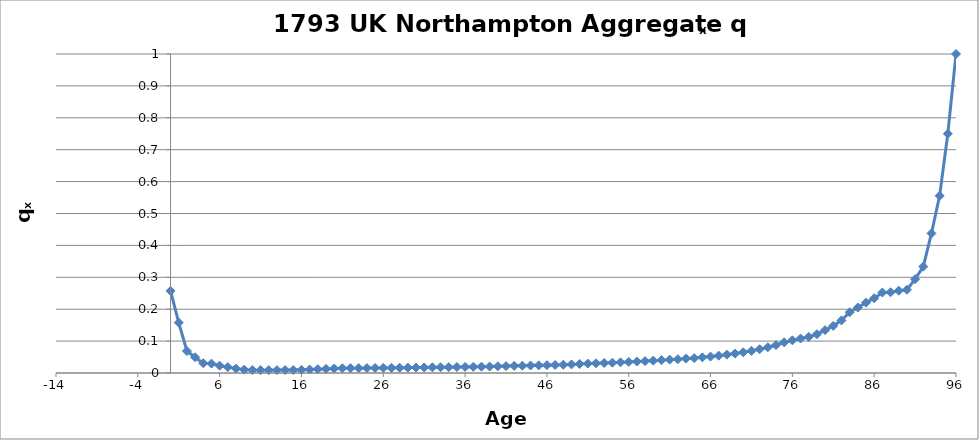
| Category | qx |
|---|---|
| 0.0 | 0.258 |
| 1.0 | 0.158 |
| 2.0 | 0.069 |
| 3.0 | 0.049 |
| 4.0 | 0.031 |
| 5.0 | 0.029 |
| 6.0 | 0.023 |
| 7.0 | 0.019 |
| 8.0 | 0.014 |
| 9.0 | 0.01 |
| 10.0 | 0.009 |
| 11.0 | 0.009 |
| 12.0 | 0.009 |
| 13.0 | 0.009 |
| 14.0 | 0.009 |
| 15.0 | 0.009 |
| 16.0 | 0.01 |
| 17.0 | 0.011 |
| 18.0 | 0.012 |
| 19.0 | 0.013 |
| 20.0 | 0.014 |
| 21.0 | 0.015 |
| 22.0 | 0.015 |
| 23.0 | 0.015 |
| 24.0 | 0.016 |
| 25.0 | 0.016 |
| 26.0 | 0.016 |
| 27.0 | 0.016 |
| 28.0 | 0.017 |
| 29.0 | 0.017 |
| 30.0 | 0.017 |
| 31.0 | 0.017 |
| 32.0 | 0.018 |
| 33.0 | 0.018 |
| 34.0 | 0.018 |
| 35.0 | 0.019 |
| 36.0 | 0.019 |
| 37.0 | 0.019 |
| 38.0 | 0.02 |
| 39.0 | 0.02 |
| 40.0 | 0.021 |
| 41.0 | 0.022 |
| 42.0 | 0.022 |
| 43.0 | 0.023 |
| 44.0 | 0.023 |
| 45.0 | 0.024 |
| 46.0 | 0.025 |
| 47.0 | 0.025 |
| 48.0 | 0.026 |
| 49.0 | 0.027 |
| 50.0 | 0.028 |
| 51.0 | 0.03 |
| 52.0 | 0.03 |
| 53.0 | 0.031 |
| 54.0 | 0.032 |
| 55.0 | 0.034 |
| 56.0 | 0.035 |
| 57.0 | 0.036 |
| 58.0 | 0.037 |
| 59.0 | 0.039 |
| 60.0 | 0.04 |
| 61.0 | 0.042 |
| 62.0 | 0.043 |
| 63.0 | 0.045 |
| 64.0 | 0.047 |
| 65.0 | 0.049 |
| 66.0 | 0.052 |
| 67.0 | 0.054 |
| 68.0 | 0.057 |
| 69.0 | 0.061 |
| 70.0 | 0.065 |
| 71.0 | 0.069 |
| 72.0 | 0.075 |
| 73.0 | 0.081 |
| 74.0 | 0.088 |
| 75.0 | 0.096 |
| 76.0 | 0.102 |
| 77.0 | 0.108 |
| 78.0 | 0.113 |
| 79.0 | 0.122 |
| 80.0 | 0.134 |
| 81.0 | 0.148 |
| 82.0 | 0.165 |
| 83.0 | 0.19 |
| 84.0 | 0.205 |
| 85.0 | 0.22 |
| 86.0 | 0.234 |
| 87.0 | 0.252 |
| 88.0 | 0.253 |
| 89.0 | 0.258 |
| 90.0 | 0.261 |
| 91.0 | 0.294 |
| 92.0 | 0.333 |
| 93.0 | 0.438 |
| 94.0 | 0.556 |
| 95.0 | 0.75 |
| 96.0 | 1 |